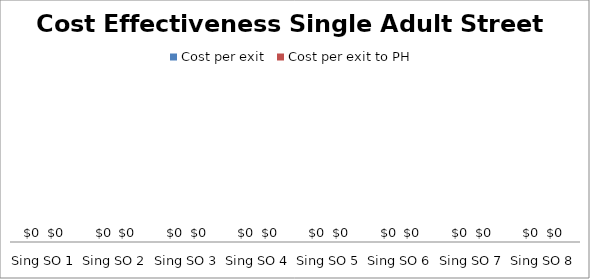
| Category | Cost per exit | Cost per exit to PH |
|---|---|---|
| Sing SO 1 | 0 | 0 |
| Sing SO 2 | 0 | 0 |
| Sing SO 3 | 0 | 0 |
| Sing SO 4 | 0 | 0 |
| Sing SO 5 | 0 | 0 |
| Sing SO 6 | 0 | 0 |
| Sing SO 7 | 0 | 0 |
| Sing SO 8 | 0 | 0 |